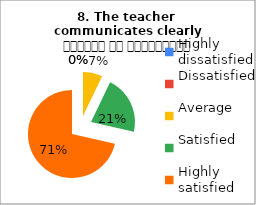
| Category | 8. The teacher 
communicates clearly शिक्षक का सम्प्रेषण सुस्पष्ट है |
|---|---|
| Highly dissatisfied | 0 |
| Dissatisfied | 0 |
| Average | 1 |
| Satisfied | 3 |
| Highly satisfied | 10 |